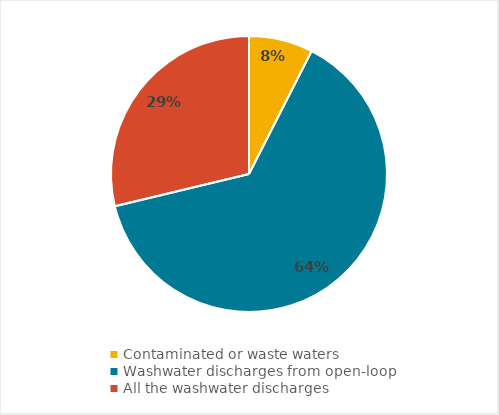
| Category | Series 0 |
|---|---|
| Contaminated or waste waters | 0.075 |
| Washwater discharges from open-loop | 0.638 |
| All the washwater discharges | 0.288 |